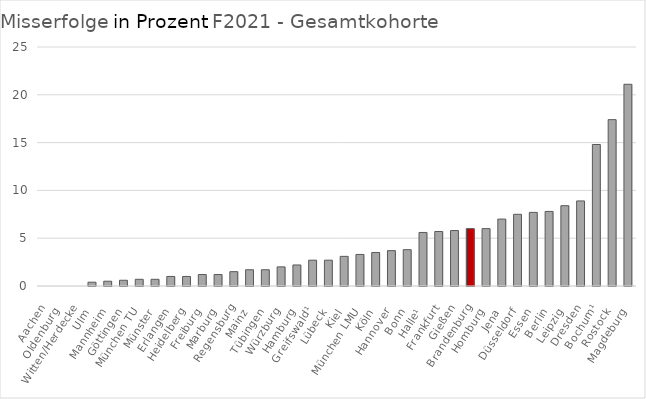
| Category | Misserfolg Ges |
|---|---|
| Aachen | 0 |
| Oldenburg | 0 |
| Witten/Herdecke | 0 |
| Ulm | 0.4 |
| Mannheim | 0.5 |
| Göttingen | 0.6 |
| München TU | 0.7 |
| Münster | 0.7 |
| Erlangen | 1 |
| Heidelberg | 1 |
| Freiburg | 1.2 |
| Marburg | 1.2 |
| Regensburg | 1.5 |
| Mainz | 1.7 |
| Tübingen | 1.7 |
| Würzburg | 2 |
| Hamburg | 2.2 |
| Greifswald¹ | 2.7 |
| Lübeck | 2.7 |
| Kiel | 3.1 |
| München LMU | 3.3 |
| Köln | 3.5 |
| Hannover | 3.7 |
| Bonn | 3.8 |
| Halle¹ | 5.6 |
| Frankfurt | 5.7 |
| Gießen | 5.8 |
| Brandenburg | 6 |
| Homburg | 6 |
| Jena | 7 |
| Düsseldorf | 7.5 |
| Essen | 7.7 |
| Berlin | 7.8 |
| Leipzig | 8.4 |
| Dresden | 8.9 |
| Bochum¹ | 14.8 |
| Rostock | 17.4 |
| Magdeburg | 21.1 |